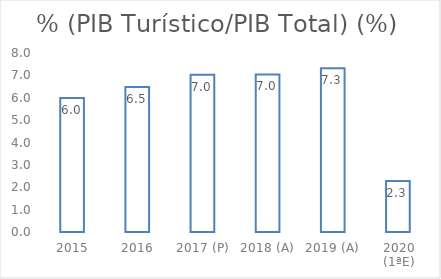
| Category | % (PIB Turístico/PIB Total) (%) |
|---|---|
| 2015 | 5.991 |
| 2016 | 6.483 |
| 2017 (P) | 7.025 |
| 2018 (A) | 7.04 |
| 2019 (A) | 7.318 |
| 2020 (1ªE) | 2.28 |